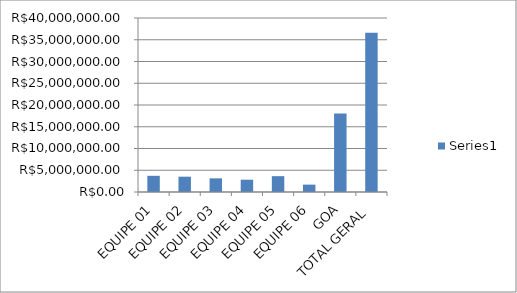
| Category | Series 0 |
|---|---|
| EQUIPE 01 | 3722500 |
| EQUIPE 02 | 3522500 |
| EQUIPE 03 | 3138650 |
| EQUIPE 04 | 2825000 |
| EQUIPE 05 | 3640000 |
| EQUIPE 06 | 1695000 |
| GOA | 18047000 |
| TOTAL GERAL | 36590650 |